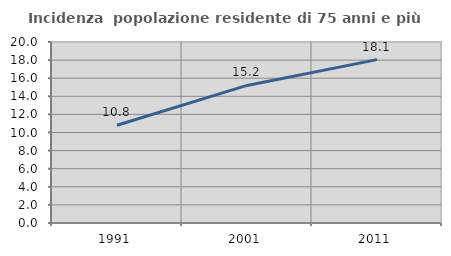
| Category | Incidenza  popolazione residente di 75 anni e più |
|---|---|
| 1991.0 | 10.807 |
| 2001.0 | 15.2 |
| 2011.0 | 18.053 |